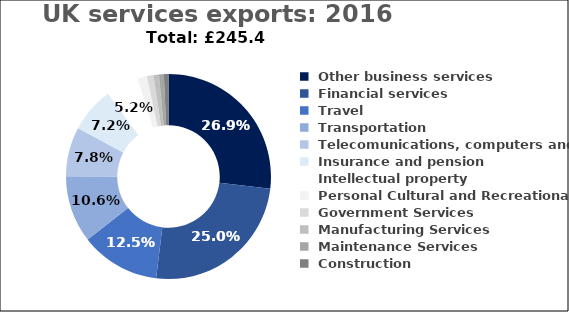
| Category | Series 0 |
|---|---|
|  Other business services  | 66.051 |
|  Financial services  | 61.383 |
|  Travel  | 30.756 |
|  Transportation  | 25.95 |
|  Telecomunications, computers and IT  | 19.036 |
|  Insurance and pension  | 17.63 |
|  Intellectual property  | 12.649 |
|  Personal Cultural and Recreational  | 3.631 |
|  Government Services  | 2.568 |
|  Manufacturing Services  | 2.094 |
|  Maintenance Services  | 1.871 |
|  Construction  | 1.787 |